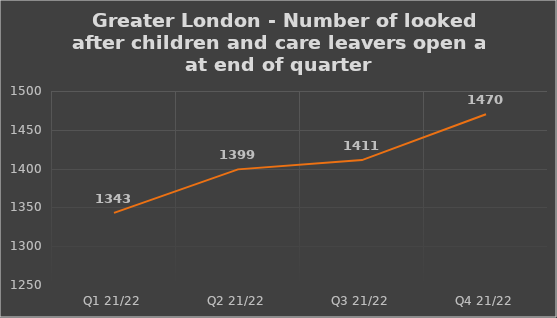
| Category | Number of open cases  |
|---|---|
| Q1 21/22 | 1343 |
| Q2 21/22 | 1399 |
| Q3 21/22 | 1411 |
| Q4 21/22 | 1470 |